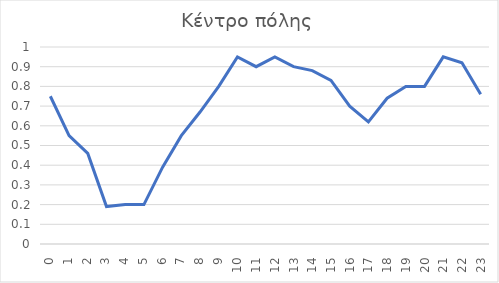
| Category | Series 0 |
|---|---|
| 0.0 | 0.75 |
| 1.0 | 0.55 |
| 2.0 | 0.46 |
| 3.0 | 0.19 |
| 4.0 | 0.2 |
| 5.0 | 0.2 |
| 6.0 | 0.39 |
| 7.0 | 0.55 |
| 8.0 | 0.67 |
| 9.0 | 0.8 |
| 10.0 | 0.95 |
| 11.0 | 0.9 |
| 12.0 | 0.95 |
| 13.0 | 0.9 |
| 14.0 | 0.88 |
| 15.0 | 0.83 |
| 16.0 | 0.7 |
| 17.0 | 0.62 |
| 18.0 | 0.74 |
| 19.0 | 0.8 |
| 20.0 | 0.8 |
| 21.0 | 0.95 |
| 22.0 | 0.92 |
| 23.0 | 0.76 |